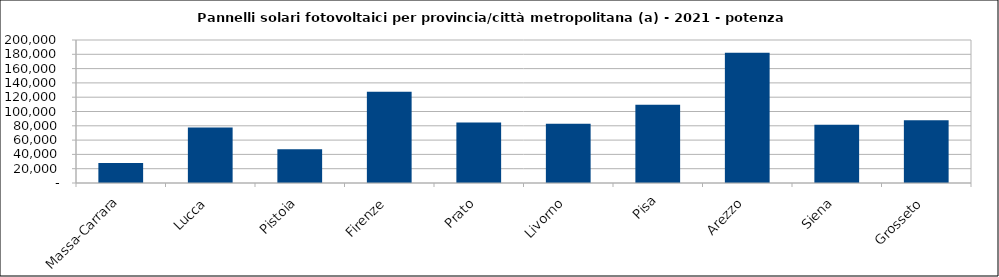
| Category | Series 0 |
|---|---|
| Massa-Carrara | 27812.17 |
| Lucca | 77587.42 |
| Pistoia | 47220.42 |
| Firenze | 127529.67 |
| Prato | 84703.74 |
| Livorno | 82741.64 |
| Pisa | 109325.83 |
| Arezzo | 182206.7 |
| Siena | 81375.55 |
| Grosseto | 87774.5 |